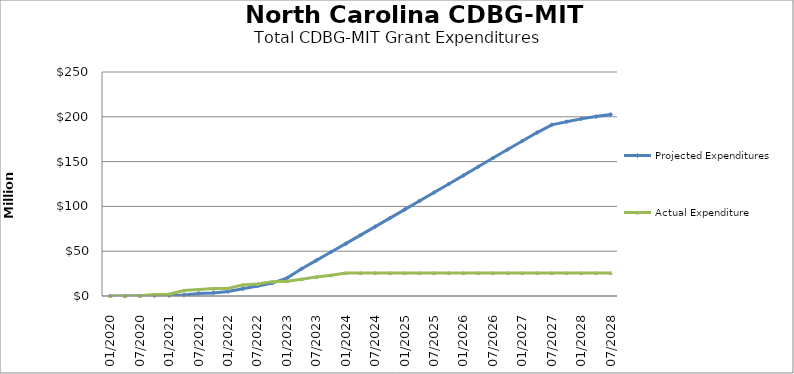
| Category | Projected Expenditures | Actual Expenditure |
|---|---|---|
| 01/2020 | 18934.446 | 0 |
| 04/2020 | 37847.561 | 0 |
| 07/2020 | 161413.244 | 274138.69 |
| 10/2020 | 353066.139 | 1630136.56 |
| 01/2021 | 574980.018 | 2069610.51 |
| 04/2021 | 993687.28 | 6125089.88 |
| 07/2021 | 2859148.887 | 7206271.93 |
| 10/2021 | 3482291.231 | 8249729 |
| 01/2022 | 5040955.542 | 8337416.56 |
| 04/2022 | 8046363.257 | 12423148.85 |
| 07/2022 | 11123640.807 | 13357397.11 |
| 10/2022 | 14360918.358 | 16041167.66 |
| 01/2023 | 19993881.494 | 16544013.24 |
| 04/2023 | 30357294.196 | 18803902.85 |
| 07/2023 | 39770706.898 | 21331656.97 |
| 10/2023 | 49134119.6 | 23165500.03 |
| 01/2024 | 58397532.302 | 25725664.51 |
| 04/2024 | 67910945.004 | 25725664.51 |
| 07/2024 | 77424357.706 | 25725664.51 |
| 10/2024 | 86937770.409 | 25725664.51 |
| 01/2025 | 96451183.111 | 25725664.51 |
| 04/2025 | 105964595.813 | 25725664.51 |
| 07/2025 | 115478008.515 | 25725664.51 |
| 10/2025 | 125041421.217 | 25725664.51 |
| 01/2026 | 134604833.919 | 25725664.51 |
| 04/2026 | 144268246.621 | 25725664.51 |
| 07/2026 | 153931659.323 | 25725664.51 |
| 10/2026 | 163495072.025 | 25725664.51 |
| 01/2027 | 173008484.727 | 25725664.51 |
| 04/2027 | 182421897.429 | 25725664.51 |
| 07/2027 | 191070154.995 | 25725664.51 |
| 10/2027 | 194486003.181 | 25725664.51 |
| 01/2028 | 197701851.367 | 25725664.51 |
| 04/2028 | 200251655.884 | 25725664.51 |
| 07/2028 | 202636014.736 | 25725664.51 |